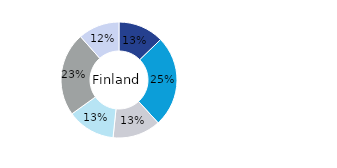
| Category | Finland |
|---|---|
| Kontor | 0.127 |
| Bostäder | 0.255 |
| Handel | 0.134 |
| Logistik* | 0.134 |
| Samhällsfastigheter | 0.234 |
| Övrigt | 0.115 |